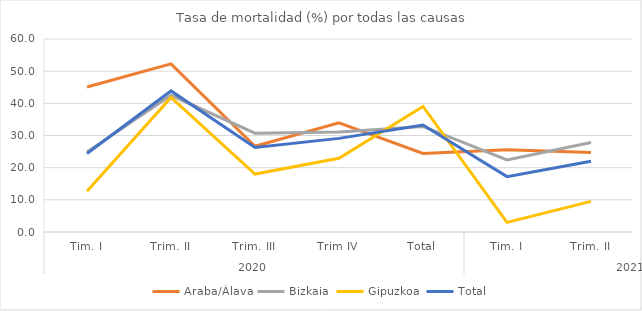
| Category | Araba/Álava | Bizkaia | Gipuzkoa | Total |
|---|---|---|---|---|
| 0 | 45.059 | 24.886 | 12.637 | 24.387 |
| 1 | 52.263 | 42.505 | 41.849 | 43.85 |
| 2 | 26.655 | 30.709 | 18.014 | 26.257 |
| 3 | 33.911 | 31.056 | 22.931 | 29.109 |
| 4 | 24.43 | 32.823 | 39.035 | 33.252 |
| 5 | 25.582 | 22.383 | 2.98 | 17.215 |
| 6 | 24.717 | 27.81 | 9.516 | 21.996 |